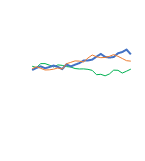
| Category | Item1 | Item2 | Item3 |
|---|---|---|---|
| 0 | 6308 | 5959 | 6090 |
| 1 | 6187 | 6151 | 6264 |
| 2 | 6547 | 6297 | 6117 |
| 3 | 6552 | 6122 | 5965 |
| 4 | 6411 | 6233 | 5979 |
| 5 | 6242 | 6369 | 6038 |
| 6 | 6432 | 6239 | 6151 |
| 7 | 6389 | 6050 | 6054 |
| 8 | 6276 | 6482 | 6540 |
| 9 | 6235 | 6291 | 6665 |
| 10 | 6098 | 6452 | 6799 |
| 11 | 6057 | 6595 | 6780 |
| 12 | 6065 | 6832 | 6704 |
| 13 | 6023 | 6838 | 7062 |
| 14 | 5930 | 6916 | 7339 |
| 15 | 5532 | 7190 | 7179 |
| 16 | 5567 | 7436 | 7094 |
| 17 | 5429 | 7166 | 7114 |
| 18 | 5598 | 7100 | 7217 |
| 19 | 5951 | 7157 | 7377 |
| 20 | 5935 | 7497 | 7217 |
| 21 | 5681 | 7615 | 7017 |
| 22 | 5857 | 7836 | 6817 |
| 23 | 6045 | 7396 | 6777 |